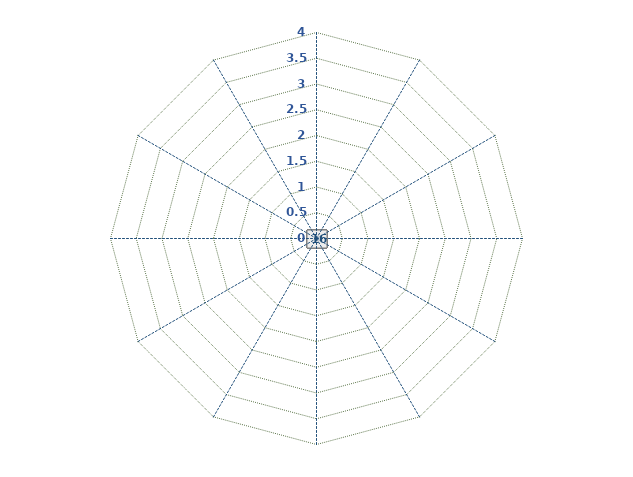
| Category | Series 0 | Series 1 | Series 2 | Series 3 |
|---|---|---|---|---|
| 0 |  |  |  | 0 |
| 1 |  |  |  | 0 |
| 2 |  |  |  | 0 |
| 3 |  |  |  | 0 |
| 4 |  |  |  | 0 |
| 5 |  |  |  | 0 |
| 6 |  |  |  | 0 |
| 7 |  |  |  | 0 |
| 8 |  |  |  | 0 |
| 9 |  |  |  | 0 |
| 10 |  |  |  | 0 |
| 11 |  |  |  | 0 |